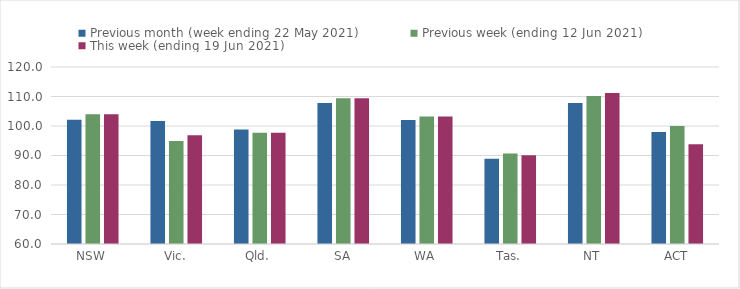
| Category | Previous month (week ending 22 May 2021) | Previous week (ending 12 Jun 2021) | This week (ending 19 Jun 2021) |
|---|---|---|---|
| NSW | 102.09 | 104 | 104 |
| Vic. | 101.7 | 94.95 | 96.9 |
| Qld. | 98.85 | 97.7 | 97.7 |
| SA | 107.78 | 109.41 | 109.41 |
| WA | 102.05 | 103.23 | 103.23 |
| Tas. | 88.92 | 90.71 | 90.1 |
| NT | 107.77 | 110.19 | 111.16 |
| ACT | 98 | 100 | 93.84 |